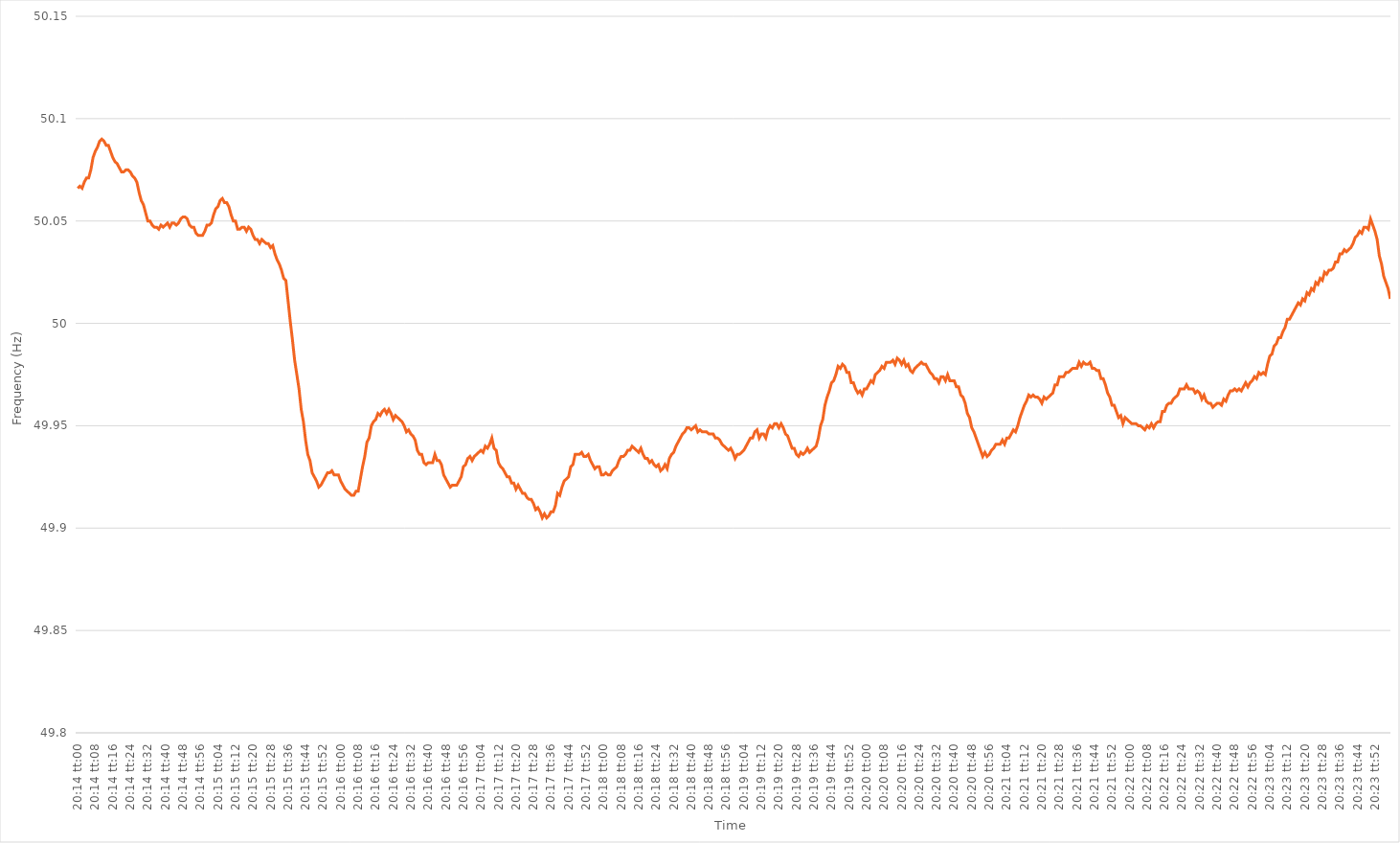
| Category | Series 0 |
|---|---|
| 0.8430555555555556 | 50.066 |
| 0.8430671296296296 | 50.067 |
| 0.8430787037037036 | 50.066 |
| 0.8430902777777778 | 50.069 |
| 0.8431018518518519 | 50.071 |
| 0.8431134259259259 | 50.071 |
| 0.843125 | 50.075 |
| 0.843136574074074 | 50.081 |
| 0.8431481481481482 | 50.084 |
| 0.8431597222222221 | 50.086 |
| 0.8431712962962963 | 50.089 |
| 0.8431828703703704 | 50.09 |
| 0.8431944444444445 | 50.089 |
| 0.8432060185185185 | 50.087 |
| 0.8432175925925925 | 50.087 |
| 0.8432291666666667 | 50.084 |
| 0.8432407407407408 | 50.081 |
| 0.8432523148148148 | 50.079 |
| 0.8432638888888889 | 50.078 |
| 0.843275462962963 | 50.076 |
| 0.843287037037037 | 50.074 |
| 0.843298611111111 | 50.074 |
| 0.8433101851851852 | 50.075 |
| 0.8433217592592593 | 50.075 |
| 0.8433333333333333 | 50.074 |
| 0.8433449074074074 | 50.072 |
| 0.8433564814814815 | 50.071 |
| 0.8433680555555556 | 50.069 |
| 0.8433796296296295 | 50.064 |
| 0.8433912037037037 | 50.06 |
| 0.8434027777777778 | 50.058 |
| 0.8434143518518519 | 50.054 |
| 0.8434259259259259 | 50.05 |
| 0.8434375 | 50.05 |
| 0.8434490740740741 | 50.048 |
| 0.8434606481481483 | 50.047 |
| 0.8434722222222222 | 50.047 |
| 0.8434837962962963 | 50.046 |
| 0.8434953703703704 | 50.048 |
| 0.8435069444444445 | 50.047 |
| 0.8435185185185184 | 50.048 |
| 0.8435300925925926 | 50.049 |
| 0.8435416666666667 | 50.047 |
| 0.8435532407407407 | 50.049 |
| 0.8435648148148148 | 50.049 |
| 0.8435763888888889 | 50.048 |
| 0.843587962962963 | 50.049 |
| 0.8435995370370369 | 50.051 |
| 0.8436111111111111 | 50.052 |
| 0.8436226851851852 | 50.052 |
| 0.8436342592592593 | 50.051 |
| 0.8436458333333333 | 50.048 |
| 0.8436574074074074 | 50.047 |
| 0.8436689814814815 | 50.047 |
| 0.8436805555555557 | 50.044 |
| 0.8436921296296296 | 50.043 |
| 0.8437037037037037 | 50.043 |
| 0.8437152777777778 | 50.043 |
| 0.8437268518518519 | 50.045 |
| 0.8437384259259259 | 50.048 |
| 0.84375 | 50.048 |
| 0.8437615740740741 | 50.049 |
| 0.8437731481481481 | 50.053 |
| 0.8437847222222222 | 50.056 |
| 0.8437962962962963 | 50.057 |
| 0.8438078703703704 | 50.06 |
| 0.8438194444444443 | 50.061 |
| 0.8438310185185185 | 50.059 |
| 0.8438425925925926 | 50.059 |
| 0.8438541666666667 | 50.057 |
| 0.8438657407407407 | 50.053 |
| 0.8438773148148148 | 50.05 |
| 0.8438888888888889 | 50.05 |
| 0.8439004629629631 | 50.046 |
| 0.843912037037037 | 50.046 |
| 0.8439236111111111 | 50.047 |
| 0.8439351851851852 | 50.047 |
| 0.8439467592592593 | 50.045 |
| 0.8439583333333333 | 50.047 |
| 0.8439699074074074 | 50.046 |
| 0.8439814814814816 | 50.043 |
| 0.8439930555555555 | 50.041 |
| 0.8440046296296296 | 50.041 |
| 0.8440162037037037 | 50.039 |
| 0.8440277777777778 | 50.041 |
| 0.8440393518518517 | 50.04 |
| 0.8440509259259259 | 50.039 |
| 0.8440625 | 50.039 |
| 0.8440740740740741 | 50.037 |
| 0.8440856481481481 | 50.038 |
| 0.8440972222222222 | 50.034 |
| 0.8441087962962963 | 50.031 |
| 0.8441203703703705 | 50.029 |
| 0.8441319444444444 | 50.026 |
| 0.8441435185185185 | 50.022 |
| 0.8441550925925926 | 50.021 |
| 0.8441666666666667 | 50.011 |
| 0.8441782407407407 | 50.001 |
| 0.8441898148148148 | 49.992 |
| 0.844201388888889 | 49.982 |
| 0.844212962962963 | 49.975 |
| 0.844224537037037 | 49.968 |
| 0.8442361111111111 | 49.958 |
| 0.8442476851851852 | 49.952 |
| 0.8442592592592592 | 49.943 |
| 0.8442708333333333 | 49.936 |
| 0.8442824074074075 | 49.933 |
| 0.8442939814814815 | 49.927 |
| 0.8443055555555555 | 49.925 |
| 0.8443171296296296 | 49.923 |
| 0.8443287037037037 | 49.92 |
| 0.8443402777777779 | 49.921 |
| 0.8443518518518518 | 49.923 |
| 0.844363425925926 | 49.925 |
| 0.844375 | 49.927 |
| 0.8443865740740741 | 49.927 |
| 0.8443981481481481 | 49.928 |
| 0.8444097222222222 | 49.926 |
| 0.8444212962962964 | 49.926 |
| 0.8444328703703704 | 49.926 |
| 0.8444444444444444 | 49.923 |
| 0.8444560185185185 | 49.921 |
| 0.8444675925925926 | 49.919 |
| 0.8444791666666666 | 49.918 |
| 0.8444907407407407 | 49.917 |
| 0.8445023148148149 | 49.916 |
| 0.8445138888888889 | 49.916 |
| 0.8445254629629629 | 49.918 |
| 0.844537037037037 | 49.918 |
| 0.8445486111111111 | 49.924 |
| 0.8445601851851853 | 49.93 |
| 0.8445717592592592 | 49.935 |
| 0.8445833333333334 | 49.942 |
| 0.8445949074074074 | 49.944 |
| 0.8446064814814815 | 49.95 |
| 0.8446180555555555 | 49.952 |
| 0.8446296296296296 | 49.953 |
| 0.8446412037037038 | 49.956 |
| 0.8446527777777778 | 49.955 |
| 0.8446643518518518 | 49.957 |
| 0.8446759259259259 | 49.958 |
| 0.8446875 | 49.956 |
| 0.844699074074074 | 49.958 |
| 0.8447106481481481 | 49.956 |
| 0.8447222222222223 | 49.953 |
| 0.8447337962962963 | 49.955 |
| 0.8447453703703703 | 49.954 |
| 0.8447569444444444 | 49.953 |
| 0.8447685185185185 | 49.952 |
| 0.8447800925925927 | 49.95 |
| 0.8447916666666666 | 49.947 |
| 0.8448032407407408 | 49.948 |
| 0.8448148148148148 | 49.946 |
| 0.844826388888889 | 49.945 |
| 0.8448379629629629 | 49.943 |
| 0.844849537037037 | 49.938 |
| 0.8448611111111112 | 49.936 |
| 0.8448726851851852 | 49.936 |
| 0.8448842592592593 | 49.932 |
| 0.8448958333333333 | 49.931 |
| 0.8449074074074074 | 49.932 |
| 0.8449189814814816 | 49.932 |
| 0.8449305555555555 | 49.932 |
| 0.8449421296296297 | 49.936 |
| 0.8449537037037037 | 49.933 |
| 0.8449652777777777 | 49.933 |
| 0.8449768518518518 | 49.931 |
| 0.8449884259259259 | 49.926 |
| 0.8450000000000001 | 49.924 |
| 0.845011574074074 | 49.922 |
| 0.8450231481481482 | 49.92 |
| 0.8450347222222222 | 49.921 |
| 0.8450462962962964 | 49.921 |
| 0.8450578703703703 | 49.921 |
| 0.8450694444444444 | 49.923 |
| 0.8450810185185186 | 49.925 |
| 0.8450925925925926 | 49.93 |
| 0.8451041666666667 | 49.931 |
| 0.8451157407407407 | 49.934 |
| 0.8451273148148148 | 49.935 |
| 0.845138888888889 | 49.933 |
| 0.8451504629629629 | 49.935 |
| 0.8451620370370371 | 49.936 |
| 0.8451736111111111 | 49.937 |
| 0.8451851851851852 | 49.938 |
| 0.8451967592592592 | 49.937 |
| 0.8452083333333333 | 49.94 |
| 0.8452199074074075 | 49.939 |
| 0.8452314814814814 | 49.941 |
| 0.8452430555555556 | 49.944 |
| 0.8452546296296296 | 49.939 |
| 0.8452662037037038 | 49.938 |
| 0.8452777777777777 | 49.932 |
| 0.8452893518518518 | 49.93 |
| 0.845300925925926 | 49.929 |
| 0.8453125 | 49.927 |
| 0.8453240740740741 | 49.925 |
| 0.8453356481481481 | 49.925 |
| 0.8453472222222222 | 49.922 |
| 0.8453587962962964 | 49.922 |
| 0.8453703703703703 | 49.919 |
| 0.8453819444444445 | 49.921 |
| 0.8453935185185185 | 49.919 |
| 0.8454050925925927 | 49.917 |
| 0.8454166666666666 | 49.917 |
| 0.8454282407407407 | 49.915 |
| 0.8454398148148149 | 49.914 |
| 0.8454513888888888 | 49.914 |
| 0.845462962962963 | 49.912 |
| 0.845474537037037 | 49.909 |
| 0.8454861111111112 | 49.91 |
| 0.8454976851851851 | 49.908 |
| 0.8455092592592592 | 49.905 |
| 0.8455208333333334 | 49.907 |
| 0.8455324074074074 | 49.905 |
| 0.8455439814814815 | 49.906 |
| 0.8455555555555555 | 49.908 |
| 0.8455671296296297 | 49.908 |
| 0.8455787037037038 | 49.911 |
| 0.8455902777777777 | 49.917 |
| 0.8456018518518519 | 49.916 |
| 0.8456134259259259 | 49.92 |
| 0.8456250000000001 | 49.923 |
| 0.845636574074074 | 49.924 |
| 0.8456481481481481 | 49.925 |
| 0.8456597222222223 | 49.93 |
| 0.8456712962962962 | 49.931 |
| 0.8456828703703704 | 49.936 |
| 0.8456944444444444 | 49.936 |
| 0.8457060185185186 | 49.936 |
| 0.8457175925925925 | 49.937 |
| 0.8457291666666666 | 49.935 |
| 0.8457407407407408 | 49.935 |
| 0.8457523148148148 | 49.936 |
| 0.8457638888888889 | 49.933 |
| 0.8457754629629629 | 49.931 |
| 0.8457870370370371 | 49.929 |
| 0.8457986111111112 | 49.93 |
| 0.8458101851851851 | 49.93 |
| 0.8458217592592593 | 49.926 |
| 0.8458333333333333 | 49.926 |
| 0.8458449074074075 | 49.927 |
| 0.8458564814814814 | 49.926 |
| 0.8458680555555556 | 49.926 |
| 0.8458796296296297 | 49.928 |
| 0.8458912037037036 | 49.929 |
| 0.8459027777777778 | 49.93 |
| 0.8459143518518518 | 49.933 |
| 0.845925925925926 | 49.935 |
| 0.8459374999999999 | 49.935 |
| 0.845949074074074 | 49.936 |
| 0.8459606481481482 | 49.938 |
| 0.8459722222222222 | 49.938 |
| 0.8459837962962963 | 49.94 |
| 0.8459953703703703 | 49.939 |
| 0.8460069444444445 | 49.938 |
| 0.8460185185185186 | 49.937 |
| 0.8460300925925925 | 49.939 |
| 0.8460416666666667 | 49.936 |
| 0.8460532407407407 | 49.934 |
| 0.8460648148148149 | 49.934 |
| 0.8460763888888888 | 49.932 |
| 0.846087962962963 | 49.933 |
| 0.8460995370370371 | 49.931 |
| 0.846111111111111 | 49.93 |
| 0.8461226851851852 | 49.931 |
| 0.8461342592592592 | 49.928 |
| 0.8461458333333334 | 49.929 |
| 0.8461574074074073 | 49.931 |
| 0.8461689814814815 | 49.929 |
| 0.8461805555555556 | 49.934 |
| 0.8461921296296296 | 49.936 |
| 0.8462037037037037 | 49.937 |
| 0.8462152777777777 | 49.94 |
| 0.8462268518518519 | 49.942 |
| 0.846238425925926 | 49.944 |
| 0.84625 | 49.946 |
| 0.8462615740740741 | 49.947 |
| 0.8462731481481481 | 49.949 |
| 0.8462847222222223 | 49.949 |
| 0.8462962962962962 | 49.948 |
| 0.8463078703703704 | 49.949 |
| 0.8463194444444445 | 49.95 |
| 0.8463310185185186 | 49.947 |
| 0.8463425925925926 | 49.948 |
| 0.8463541666666666 | 49.947 |
| 0.8463657407407408 | 49.947 |
| 0.8463773148148147 | 49.947 |
| 0.8463888888888889 | 49.946 |
| 0.846400462962963 | 49.946 |
| 0.846412037037037 | 49.946 |
| 0.8464236111111111 | 49.944 |
| 0.8464351851851851 | 49.944 |
| 0.8464467592592593 | 49.943 |
| 0.8464583333333334 | 49.941 |
| 0.8464699074074074 | 49.94 |
| 0.8464814814814815 | 49.939 |
| 0.8464930555555555 | 49.938 |
| 0.8465046296296297 | 49.939 |
| 0.8465162037037036 | 49.937 |
| 0.8465277777777778 | 49.934 |
| 0.8465393518518519 | 49.936 |
| 0.846550925925926 | 49.936 |
| 0.8465625 | 49.937 |
| 0.846574074074074 | 49.938 |
| 0.8465856481481482 | 49.94 |
| 0.8465972222222223 | 49.942 |
| 0.8466087962962963 | 49.944 |
| 0.8466203703703704 | 49.944 |
| 0.8466319444444445 | 49.947 |
| 0.8466435185185185 | 49.948 |
| 0.8466550925925925 | 49.944 |
| 0.8466666666666667 | 49.946 |
| 0.8466782407407408 | 49.946 |
| 0.8466898148148148 | 49.944 |
| 0.8467013888888889 | 49.948 |
| 0.846712962962963 | 49.95 |
| 0.8467245370370371 | 49.949 |
| 0.846736111111111 | 49.951 |
| 0.8467476851851852 | 49.951 |
| 0.8467592592592593 | 49.949 |
| 0.8467708333333334 | 49.951 |
| 0.8467824074074074 | 49.949 |
| 0.8467939814814814 | 49.946 |
| 0.8468055555555556 | 49.945 |
| 0.8468171296296297 | 49.942 |
| 0.8468287037037037 | 49.939 |
| 0.8468402777777778 | 49.939 |
| 0.8468518518518519 | 49.936 |
| 0.8468634259259259 | 49.935 |
| 0.8468749999999999 | 49.937 |
| 0.8468865740740741 | 49.936 |
| 0.8468981481481482 | 49.937 |
| 0.8469097222222222 | 49.939 |
| 0.8469212962962963 | 49.937 |
| 0.8469328703703703 | 49.938 |
| 0.8469444444444445 | 49.939 |
| 0.8469560185185184 | 49.94 |
| 0.8469675925925926 | 49.944 |
| 0.8469791666666667 | 49.95 |
| 0.8469907407407408 | 49.953 |
| 0.8470023148148148 | 49.96 |
| 0.8470138888888888 | 49.964 |
| 0.847025462962963 | 49.967 |
| 0.8470370370370371 | 49.971 |
| 0.8470486111111111 | 49.972 |
| 0.8470601851851852 | 49.975 |
| 0.8470717592592593 | 49.979 |
| 0.8470833333333333 | 49.978 |
| 0.8470949074074073 | 49.98 |
| 0.8471064814814815 | 49.979 |
| 0.8471180555555556 | 49.976 |
| 0.8471296296296296 | 49.976 |
| 0.8471412037037037 | 49.971 |
| 0.8471527777777778 | 49.971 |
| 0.8471643518518519 | 49.968 |
| 0.8471759259259258 | 49.966 |
| 0.8471875 | 49.967 |
| 0.8471990740740741 | 49.965 |
| 0.8472106481481482 | 49.968 |
| 0.8472222222222222 | 49.968 |
| 0.8472337962962962 | 49.97 |
| 0.8472453703703704 | 49.972 |
| 0.8472569444444445 | 49.971 |
| 0.8472685185185185 | 49.975 |
| 0.8472800925925926 | 49.976 |
| 0.8472916666666667 | 49.977 |
| 0.8473032407407407 | 49.979 |
| 0.8473148148148147 | 49.978 |
| 0.8473263888888889 | 49.981 |
| 0.847337962962963 | 49.981 |
| 0.847349537037037 | 49.981 |
| 0.8473611111111111 | 49.982 |
| 0.8473726851851852 | 49.98 |
| 0.8473842592592593 | 49.983 |
| 0.8473958333333332 | 49.982 |
| 0.8474074074074074 | 49.98 |
| 0.8474189814814815 | 49.982 |
| 0.8474305555555556 | 49.979 |
| 0.8474421296296296 | 49.98 |
| 0.8474537037037037 | 49.977 |
| 0.8474652777777778 | 49.976 |
| 0.847476851851852 | 49.978 |
| 0.8474884259259259 | 49.979 |
| 0.8475 | 49.98 |
| 0.8475115740740741 | 49.981 |
| 0.8475231481481482 | 49.98 |
| 0.8475347222222221 | 49.98 |
| 0.8475462962962963 | 49.978 |
| 0.8475578703703704 | 49.976 |
| 0.8475694444444444 | 49.975 |
| 0.8475810185185185 | 49.973 |
| 0.8475925925925926 | 49.973 |
| 0.8476041666666667 | 49.971 |
| 0.8476157407407406 | 49.974 |
| 0.8476273148148148 | 49.974 |
| 0.8476388888888889 | 49.972 |
| 0.847650462962963 | 49.975 |
| 0.847662037037037 | 49.972 |
| 0.8476736111111111 | 49.972 |
| 0.8476851851851852 | 49.972 |
| 0.8476967592592594 | 49.969 |
| 0.8477083333333333 | 49.969 |
| 0.8477199074074074 | 49.965 |
| 0.8477314814814815 | 49.964 |
| 0.8477430555555556 | 49.961 |
| 0.8477546296296296 | 49.956 |
| 0.8477662037037037 | 49.954 |
| 0.8477777777777779 | 49.949 |
| 0.8477893518518518 | 49.947 |
| 0.8478009259259259 | 49.944 |
| 0.8478125 | 49.941 |
| 0.8478240740740741 | 49.938 |
| 0.847835648148148 | 49.935 |
| 0.8478472222222222 | 49.937 |
| 0.8478587962962963 | 49.935 |
| 0.8478703703703704 | 49.936 |
| 0.8478819444444444 | 49.938 |
| 0.8478935185185185 | 49.939 |
| 0.8479050925925926 | 49.941 |
| 0.8479166666666668 | 49.941 |
| 0.8479282407407407 | 49.941 |
| 0.8479398148148148 | 49.943 |
| 0.8479513888888889 | 49.941 |
| 0.847962962962963 | 49.944 |
| 0.847974537037037 | 49.944 |
| 0.8479861111111111 | 49.946 |
| 0.8479976851851853 | 49.948 |
| 0.8480092592592593 | 49.947 |
| 0.8480208333333333 | 49.95 |
| 0.8480324074074074 | 49.954 |
| 0.8480439814814815 | 49.957 |
| 0.8480555555555555 | 49.96 |
| 0.8480671296296296 | 49.962 |
| 0.8480787037037038 | 49.965 |
| 0.8480902777777778 | 49.964 |
| 0.8481018518518518 | 49.965 |
| 0.8481134259259259 | 49.964 |
| 0.848125 | 49.964 |
| 0.8481365740740742 | 49.963 |
| 0.8481481481481481 | 49.961 |
| 0.8481597222222222 | 49.964 |
| 0.8481712962962963 | 49.963 |
| 0.8481828703703704 | 49.964 |
| 0.8481944444444444 | 49.965 |
| 0.8482060185185185 | 49.966 |
| 0.8482175925925927 | 49.97 |
| 0.8482291666666667 | 49.97 |
| 0.8482407407407407 | 49.974 |
| 0.8482523148148148 | 49.974 |
| 0.8482638888888889 | 49.974 |
| 0.8482754629629629 | 49.976 |
| 0.848287037037037 | 49.976 |
| 0.8482986111111112 | 49.977 |
| 0.8483101851851852 | 49.978 |
| 0.8483217592592592 | 49.978 |
| 0.8483333333333333 | 49.978 |
| 0.8483449074074074 | 49.981 |
| 0.8483564814814816 | 49.979 |
| 0.8483680555555555 | 49.981 |
| 0.8483796296296297 | 49.98 |
| 0.8483912037037037 | 49.98 |
| 0.8484027777777778 | 49.981 |
| 0.8484143518518518 | 49.978 |
| 0.8484259259259259 | 49.978 |
| 0.8484375000000001 | 49.977 |
| 0.8484490740740741 | 49.977 |
| 0.8484606481481481 | 49.973 |
| 0.8484722222222222 | 49.973 |
| 0.8484837962962963 | 49.97 |
| 0.8484953703703703 | 49.966 |
| 0.8485069444444444 | 49.964 |
| 0.8485185185185186 | 49.96 |
| 0.8485300925925926 | 49.96 |
| 0.8485416666666666 | 49.957 |
| 0.8485532407407407 | 49.954 |
| 0.8485648148148148 | 49.955 |
| 0.848576388888889 | 49.951 |
| 0.8485879629629629 | 49.954 |
| 0.848599537037037 | 49.953 |
| 0.8486111111111111 | 49.952 |
| 0.8486226851851852 | 49.951 |
| 0.8486342592592592 | 49.951 |
| 0.8486458333333333 | 49.951 |
| 0.8486574074074075 | 49.95 |
| 0.8486689814814815 | 49.95 |
| 0.8486805555555555 | 49.949 |
| 0.8486921296296296 | 49.948 |
| 0.8487037037037037 | 49.95 |
| 0.8487152777777777 | 49.949 |
| 0.8487268518518518 | 49.951 |
| 0.848738425925926 | 49.949 |
| 0.84875 | 49.951 |
| 0.848761574074074 | 49.952 |
| 0.8487731481481481 | 49.952 |
| 0.8487847222222222 | 49.957 |
| 0.8487962962962964 | 49.957 |
| 0.8488078703703703 | 49.96 |
| 0.8488194444444445 | 49.961 |
| 0.8488310185185185 | 49.961 |
| 0.8488425925925926 | 49.963 |
| 0.8488541666666666 | 49.964 |
| 0.8488657407407407 | 49.965 |
| 0.8488773148148149 | 49.968 |
| 0.8488888888888889 | 49.968 |
| 0.848900462962963 | 49.968 |
| 0.848912037037037 | 49.97 |
| 0.8489236111111111 | 49.968 |
| 0.8489351851851853 | 49.968 |
| 0.8489467592592592 | 49.968 |
| 0.8489583333333334 | 49.966 |
| 0.8489699074074074 | 49.967 |
| 0.8489814814814814 | 49.966 |
| 0.8489930555555555 | 49.963 |
| 0.8490046296296296 | 49.965 |
| 0.8490162037037038 | 49.962 |
| 0.8490277777777777 | 49.961 |
| 0.8490393518518519 | 49.961 |
| 0.8490509259259259 | 49.959 |
| 0.8490625 | 49.96 |
| 0.849074074074074 | 49.961 |
| 0.8490856481481481 | 49.961 |
| 0.8490972222222223 | 49.96 |
| 0.8491087962962963 | 49.963 |
| 0.8491203703703704 | 49.962 |
| 0.8491319444444444 | 49.965 |
| 0.8491435185185185 | 49.967 |
| 0.8491550925925927 | 49.967 |
| 0.8491666666666666 | 49.968 |
| 0.8491782407407408 | 49.967 |
| 0.8491898148148148 | 49.968 |
| 0.849201388888889 | 49.967 |
| 0.8492129629629629 | 49.969 |
| 0.849224537037037 | 49.971 |
| 0.8492361111111112 | 49.969 |
| 0.8492476851851851 | 49.971 |
| 0.8492592592592593 | 49.972 |
| 0.8492708333333333 | 49.974 |
| 0.8492824074074075 | 49.973 |
| 0.8492939814814814 | 49.976 |
| 0.8493055555555555 | 49.975 |
| 0.8493171296296297 | 49.976 |
| 0.8493287037037037 | 49.975 |
| 0.8493402777777778 | 49.98 |
| 0.8493518518518518 | 49.984 |
| 0.849363425925926 | 49.985 |
| 0.8493750000000001 | 49.989 |
| 0.849386574074074 | 49.99 |
| 0.8493981481481482 | 49.993 |
| 0.8494097222222222 | 49.993 |
| 0.8494212962962964 | 49.996 |
| 0.8494328703703703 | 49.998 |
| 0.8494444444444444 | 50.002 |
| 0.8494560185185186 | 50.002 |
| 0.8494675925925925 | 50.004 |
| 0.8494791666666667 | 50.006 |
| 0.8494907407407407 | 50.008 |
| 0.8495023148148149 | 50.01 |
| 0.8495138888888888 | 50.009 |
| 0.8495254629629629 | 50.012 |
| 0.8495370370370371 | 50.011 |
| 0.8495486111111111 | 50.015 |
| 0.8495601851851852 | 50.014 |
| 0.8495717592592592 | 50.017 |
| 0.8495833333333334 | 50.016 |
| 0.8495949074074075 | 50.02 |
| 0.8496064814814814 | 50.019 |
| 0.8496180555555556 | 50.022 |
| 0.8496296296296296 | 50.021 |
| 0.8496412037037038 | 50.025 |
| 0.8496527777777777 | 50.024 |
| 0.8496643518518519 | 50.026 |
| 0.849675925925926 | 50.026 |
| 0.8496874999999999 | 50.027 |
| 0.8496990740740741 | 50.03 |
| 0.8497106481481481 | 50.03 |
| 0.8497222222222223 | 50.034 |
| 0.8497337962962962 | 50.034 |
| 0.8497453703703703 | 50.036 |
| 0.8497569444444445 | 50.035 |
| 0.8497685185185185 | 50.036 |
| 0.8497800925925926 | 50.037 |
| 0.8497916666666666 | 50.039 |
| 0.8498032407407408 | 50.042 |
| 0.8498148148148149 | 50.043 |
| 0.8498263888888888 | 50.045 |
| 0.849837962962963 | 50.044 |
| 0.849849537037037 | 50.047 |
| 0.8498611111111112 | 50.047 |
| 0.8498726851851851 | 50.046 |
| 0.8498842592592593 | 50.051 |
| 0.8498958333333334 | 50.048 |
| 0.8499074074074073 | 50.045 |
| 0.8499189814814815 | 50.041 |
| 0.8499305555555555 | 50.033 |
| 0.8499421296296297 | 50.029 |
| 0.8499537037037036 | 50.023 |
| 0.8499652777777778 | 50.02 |
| 0.8499768518518519 | 50.017 |
| 0.8499884259259259 | 50.012 |